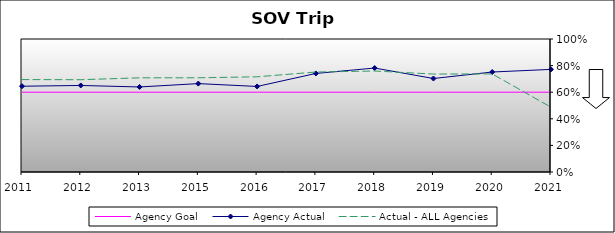
| Category | Agency Goal | Agency Actual | Actual - ALL Agencies |
|---|---|---|---|
| 2011.0 | 0.6 | 0.645 | 0.695 |
| 2012.0 | 0.6 | 0.651 | 0.694 |
| 2013.0 | 0.6 | 0.639 | 0.708 |
| 2015.0 | 0.6 | 0.665 | 0.708 |
| 2016.0 | 0.6 | 0.643 | 0.716 |
| 2017.0 | 0.6 | 0.741 | 0.752 |
| 2018.0 | 0.6 | 0.782 | 0.759 |
| 2019.0 | 0.6 | 0.703 | 0.736 |
| 2020.0 | 0.6 | 0.752 | 0.737 |
| 2021.0 | 0.6 | 0.772 | 0.487 |